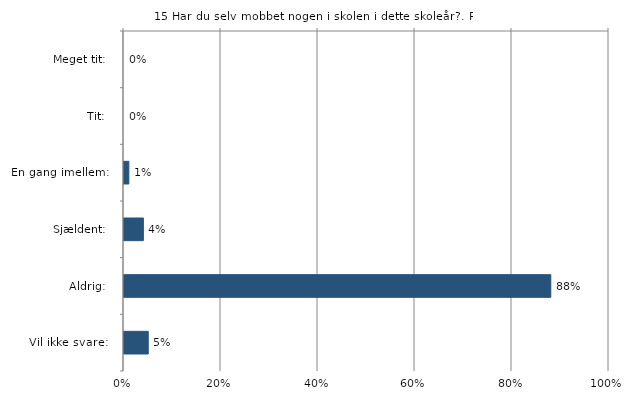
| Category | Har du selv mobbet nogen i skolen i dette skoleår? |
|---|---|
| Meget tit:   | 0 |
| Tit:   | 0 |
| En gang imellem:   | 0.01 |
| Sjældent:   | 0.04 |
| Aldrig:   | 0.88 |
| Vil ikke svare:   | 0.05 |